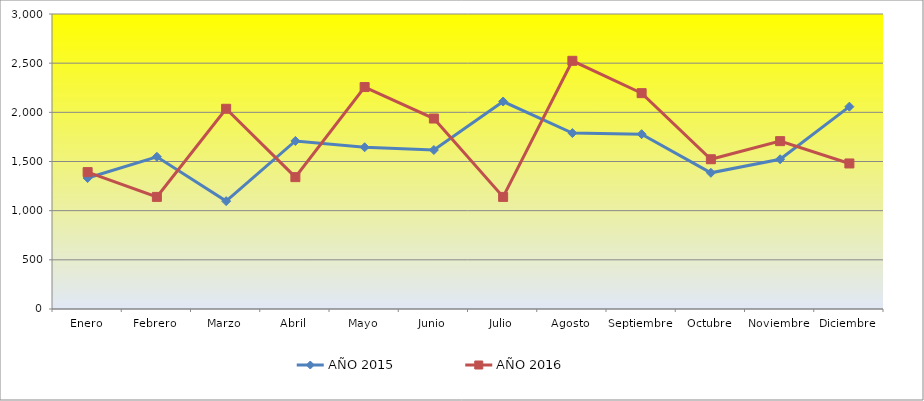
| Category | AÑO 2015 | AÑO 2016 |
|---|---|---|
| Enero | 1332 | 1392 |
| Febrero | 1548 | 1140 |
| Marzo | 1097 | 2036 |
| Abril | 1709 | 1341 |
| Mayo | 1645 | 2257 |
| Junio | 1617 | 1937 |
| Julio | 2110 | 1140 |
| Agosto | 1789 | 2524 |
| Septiembre | 1778 | 2195 |
| Octubre | 1385 | 1523 |
| Noviembre | 1523 | 1707 |
| Diciembre | 2058 | 1480 |